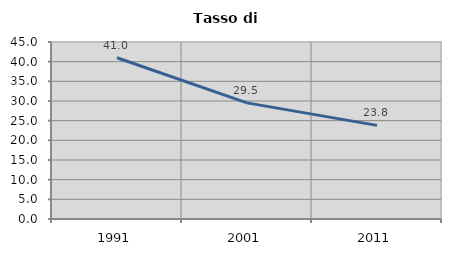
| Category | Tasso di disoccupazione   |
|---|---|
| 1991.0 | 41.001 |
| 2001.0 | 29.52 |
| 2011.0 | 23.808 |